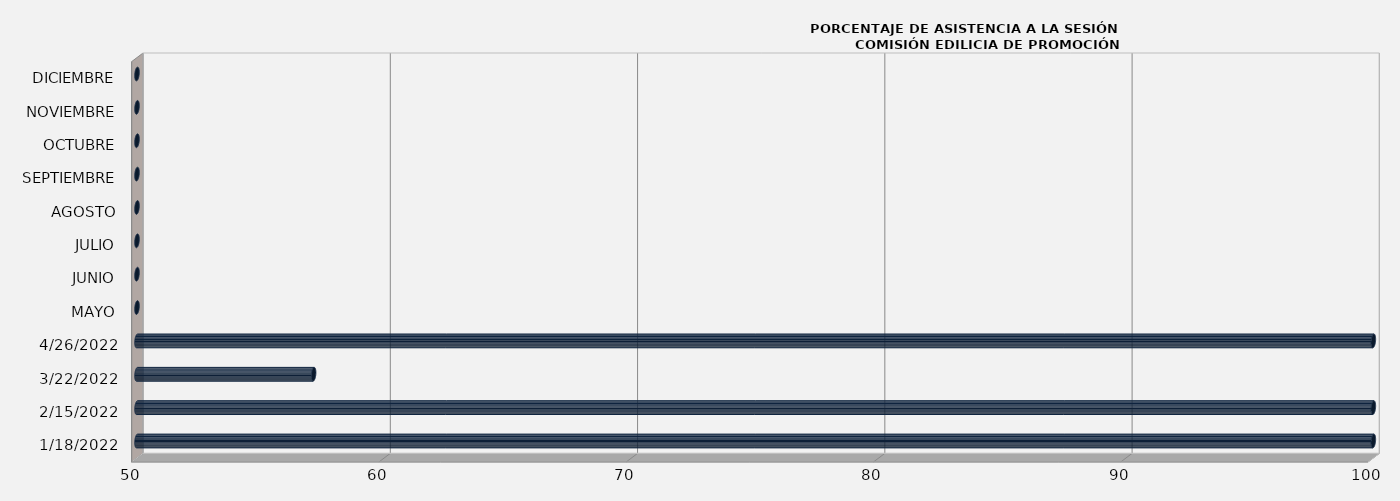
| Category | Series 0 |
|---|---|
| 18/01/2022 | 100 |
| 15/02/2022 | 100 |
| 22/03/2022 | 57.143 |
| 26/04/2022 | 100 |
| MAYO | 0 |
| JUNIO | 0 |
| JULIO | 0 |
| AGOSTO | 0 |
| SEPTIEMBRE | 0 |
| OCTUBRE | 0 |
| NOVIEMBRE | 0 |
| DICIEMBRE | 0 |